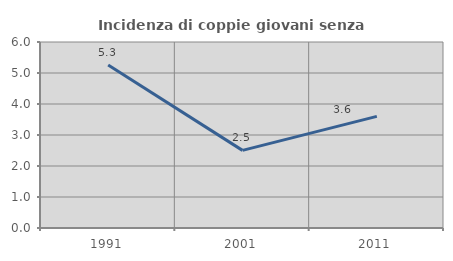
| Category | Incidenza di coppie giovani senza figli |
|---|---|
| 1991.0 | 5.255 |
| 2001.0 | 2.504 |
| 2011.0 | 3.601 |